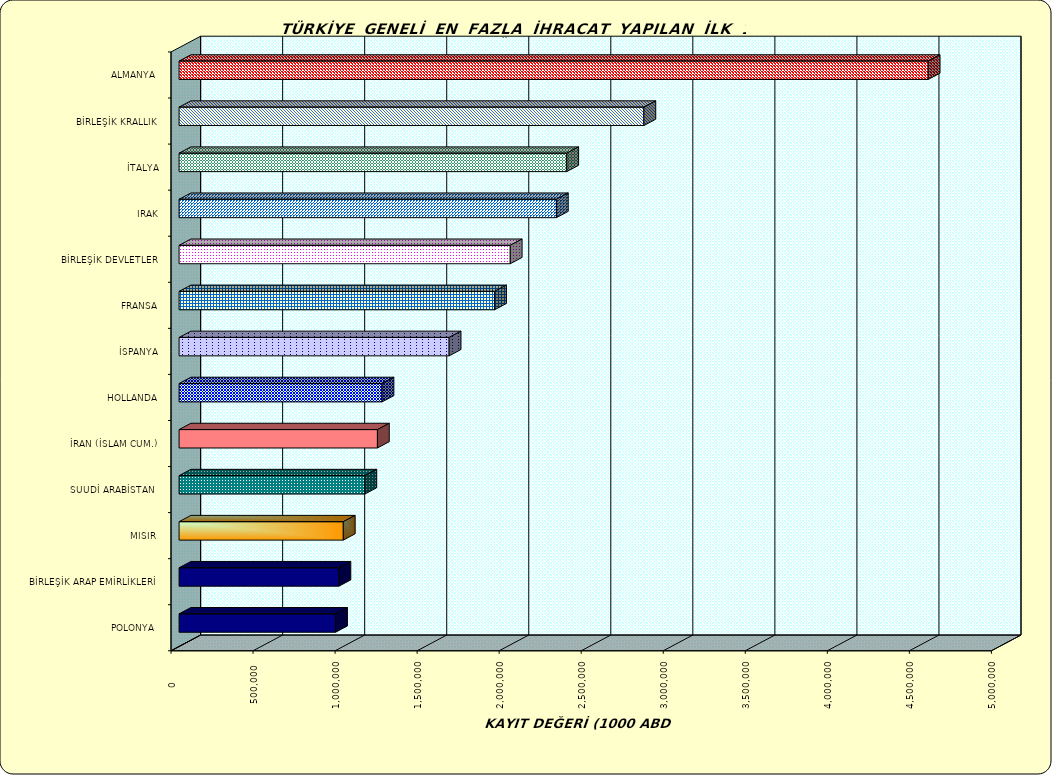
| Category | Series 0 |
|---|---|
| ALMANYA  | 4565553.846 |
| BİRLEŞİK KRALLIK | 2832862.31 |
| İTALYA | 2362804.338 |
| IRAK | 2299528.047 |
| BİRLEŞİK DEVLETLER | 2018414.761 |
| FRANSA | 1922966.47 |
| İSPANYA | 1645868.306 |
| HOLLANDA | 1236749.522 |
| İRAN (İSLAM CUM.) | 1208914.393 |
| SUUDİ ARABİSTAN  | 1132217.526 |
| MISIR  | 1000792.933 |
| BİRLEŞİK ARAP EMİRLİKLERİ | 974293.393 |
| POLONYA  | 953881.498 |